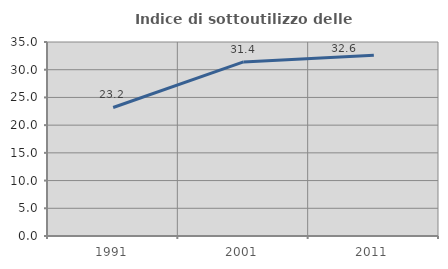
| Category | Indice di sottoutilizzo delle abitazioni  |
|---|---|
| 1991.0 | 23.186 |
| 2001.0 | 31.4 |
| 2011.0 | 32.626 |